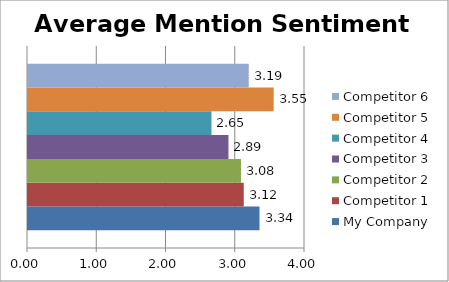
| Category | My Company | Competitor 1 | Competitor 2 | Competitor 3 | Competitor 4 | Competitor 5 | Competitor 6 |
|---|---|---|---|---|---|---|---|
| 0 | 3.343 | 3.116 | 3.075 | 2.895 | 2.649 | 3.547 | 3.188 |